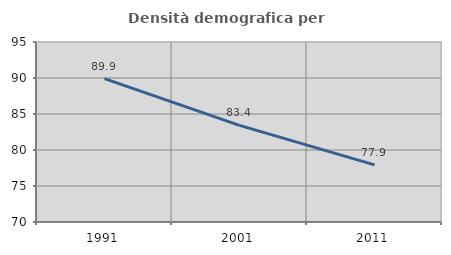
| Category | Densità demografica |
|---|---|
| 1991.0 | 89.911 |
| 2001.0 | 83.417 |
| 2011.0 | 77.928 |